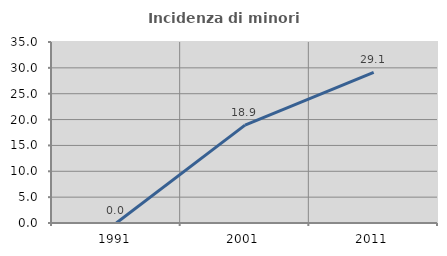
| Category | Incidenza di minori stranieri |
|---|---|
| 1991.0 | 0 |
| 2001.0 | 18.919 |
| 2011.0 | 29.114 |